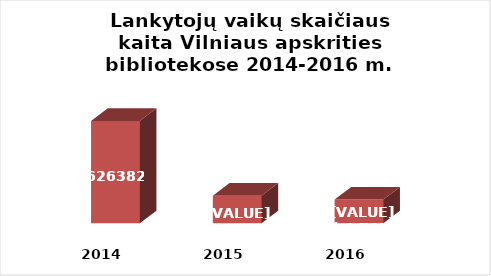
| Category | Series 0 |
|---|---|
| 2014.0 | 626382 |
| 2015.0 | 548683 |
| 2016.0 | 544662 |